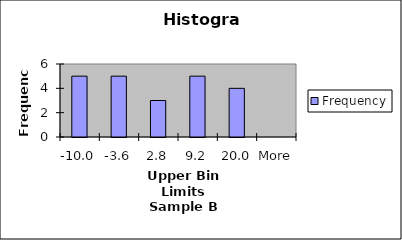
| Category | Frequency |
|---|---|
| -10.0 | 5 |
| -3.6 | 5 |
| 2.8 | 3 |
| 9.2 | 5 |
| 20.0 | 4 |
| More | 0 |